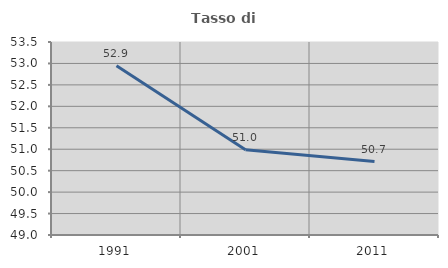
| Category | Tasso di occupazione   |
|---|---|
| 1991.0 | 52.944 |
| 2001.0 | 50.987 |
| 2011.0 | 50.713 |